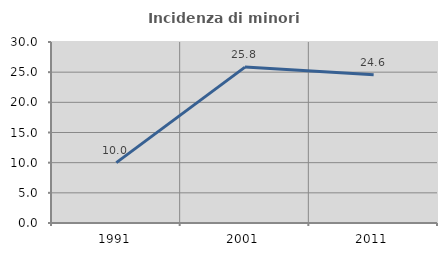
| Category | Incidenza di minori stranieri |
|---|---|
| 1991.0 | 10 |
| 2001.0 | 25.837 |
| 2011.0 | 24.578 |